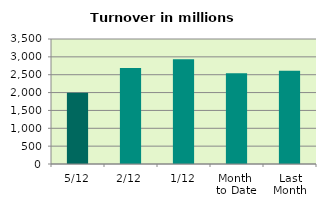
| Category | Series 0 |
|---|---|
| 5/12 | 1996.93 |
| 2/12 | 2687.404 |
| 1/12 | 2935.275 |
| Month 
to Date | 2539.87 |
| Last
Month | 2611.78 |